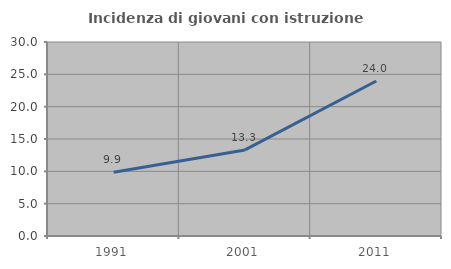
| Category | Incidenza di giovani con istruzione universitaria |
|---|---|
| 1991.0 | 9.864 |
| 2001.0 | 13.308 |
| 2011.0 | 23.973 |